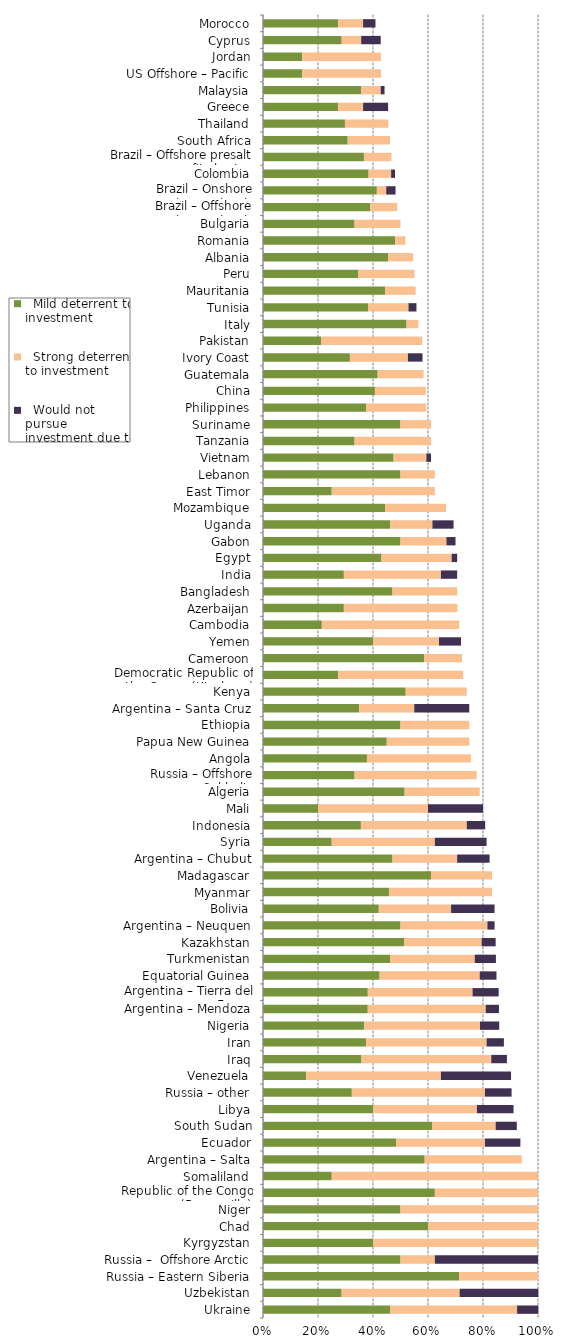
| Category |   Mild deterrent to investment |   Strong deterrent to investment |   Would not pursue investment due to this factor |
|---|---|---|---|
| Ukraine | 0.462 | 0.462 | 0.077 |
| Uzbekistan | 0.286 | 0.429 | 0.286 |
| Russia – Eastern Siberia | 0.714 | 0.286 | 0 |
| Russia –  Offshore Arctic | 0.5 | 0.125 | 0.375 |
| Kyrgyzstan | 0.4 | 0.6 | 0 |
| Chad | 0.6 | 0.4 | 0 |
| Niger | 0.5 | 0.5 | 0 |
| Republic of the Congo (Brazzaville) | 0.625 | 0.375 | 0 |
| Somaliland | 0.25 | 0.75 | 0 |
| Argentina – Salta | 0.588 | 0.353 | 0 |
| Ecuador | 0.484 | 0.323 | 0.129 |
| South Sudan | 0.615 | 0.231 | 0.077 |
| Libya | 0.4 | 0.378 | 0.133 |
| Russia – other | 0.323 | 0.484 | 0.097 |
| Venezuela | 0.157 | 0.49 | 0.255 |
| Iraq | 0.358 | 0.472 | 0.057 |
| Iran | 0.375 | 0.438 | 0.063 |
| Nigeria | 0.368 | 0.421 | 0.07 |
| Argentina – Mendoza | 0.381 | 0.429 | 0.048 |
| Argentina – Tierra del Fuego | 0.381 | 0.381 | 0.095 |
| Equatorial Guinea | 0.424 | 0.364 | 0.061 |
| Turkmenistan | 0.462 | 0.308 | 0.077 |
| Kazakhstan | 0.513 | 0.282 | 0.051 |
| Argentina – Neuquen | 0.5 | 0.316 | 0.026 |
| Bolivia | 0.421 | 0.263 | 0.158 |
| Myanmar | 0.458 | 0.375 | 0 |
| Madagascar | 0.611 | 0.222 | 0 |
| Argentina – Chubut | 0.471 | 0.235 | 0.118 |
| Syria | 0.25 | 0.375 | 0.188 |
| Indonesia | 0.356 | 0.385 | 0.067 |
| Mali | 0.2 | 0.4 | 0.2 |
| Algeria | 0.515 | 0.273 | 0 |
| Russia – Offshore Sakhalin | 0.333 | 0.444 | 0 |
| Angola | 0.378 | 0.378 | 0 |
| Papua New Guinea | 0.45 | 0.3 | 0 |
| Ethiopia | 0.5 | 0.25 | 0 |
| Argentina – Santa Cruz | 0.35 | 0.2 | 0.2 |
| Kenya | 0.519 | 0.222 | 0 |
| Democratic Republic of the Congo (Kinshasa) | 0.273 | 0.455 | 0 |
| Cameroon | 0.586 | 0.138 | 0 |
| Yemen | 0.4 | 0.24 | 0.08 |
| Cambodia | 0.214 | 0.5 | 0 |
| Azerbaijan | 0.294 | 0.412 | 0 |
| Bangladesh | 0.471 | 0.235 | 0 |
| India | 0.294 | 0.353 | 0.059 |
| Egypt | 0.431 | 0.255 | 0.02 |
| Gabon | 0.5 | 0.167 | 0.033 |
| Uganda | 0.462 | 0.154 | 0.077 |
| Mozambique | 0.444 | 0.222 | 0 |
| East Timor | 0.25 | 0.375 | 0 |
| Lebanon | 0.5 | 0.125 | 0 |
| Vietnam | 0.475 | 0.119 | 0.017 |
| Tanzania | 0.333 | 0.278 | 0 |
| Suriname | 0.5 | 0.111 | 0 |
| Philippines | 0.375 | 0.219 | 0 |
| China | 0.407 | 0.185 | 0 |
| Guatemala | 0.417 | 0.167 | 0 |
| Ivory Coast | 0.316 | 0.211 | 0.053 |
| Pakistan | 0.211 | 0.368 | 0 |
| Italy | 0.522 | 0.043 | 0 |
| Tunisia | 0.382 | 0.147 | 0.029 |
| Mauritania | 0.444 | 0.111 | 0 |
| Peru | 0.347 | 0.204 | 0 |
| Albania | 0.455 | 0.091 | 0 |
| Romania | 0.481 | 0.037 | 0 |
| Bulgaria | 0.333 | 0.167 | 0 |
| Brazil – Offshore concession contracts | 0.39 | 0.098 | 0 |
| Brazil – Onshore concession contracts | 0.414 | 0.034 | 0.034 |
| Colombia | 0.384 | 0.082 | 0.014 |
| Brazil – Offshore presalt area profit sharing contracts | 0.367 | 0.1 | 0 |
| South Africa | 0.308 | 0.154 | 0 |
| Thailand | 0.298 | 0.158 | 0 |
| Greece | 0.273 | 0.091 | 0.091 |
| Malaysia | 0.357 | 0.071 | 0.014 |
| US Offshore – Pacific | 0.143 | 0.286 | 0 |
| Jordan | 0.143 | 0.286 | 0 |
| Cyprus | 0.286 | 0.071 | 0.071 |
| Morocco | 0.273 | 0.091 | 0.045 |